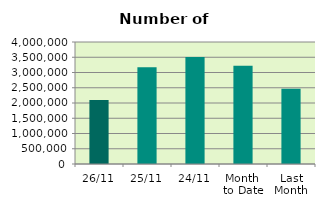
| Category | Series 0 |
|---|---|
| 26/11 | 2099354 |
| 25/11 | 3174126 |
| 24/11 | 3505218 |
| Month 
to Date | 3222703.579 |
| Last
Month | 2465363.545 |